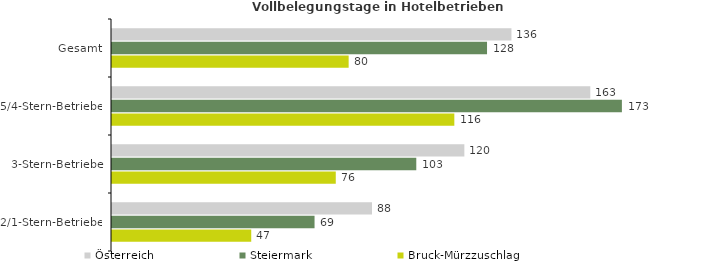
| Category | Österreich | Steiermark | Bruck-Mürzzuschlag |
|---|---|---|---|
| Gesamt | 135.866 | 127.561 | 80.492 |
| 5/4-Stern-Betriebe | 162.683 | 173.435 | 116.439 |
| 3-Stern-Betriebe | 119.851 | 103.499 | 76.113 |
| 2/1-Stern-Betriebe | 88.435 | 68.894 | 47.358 |